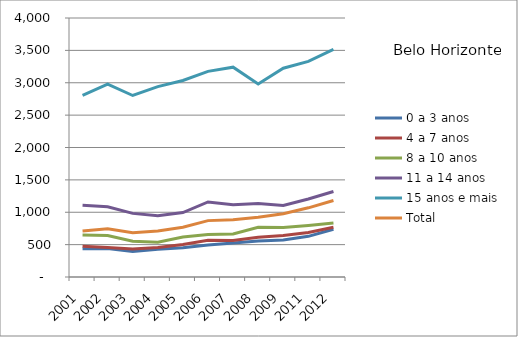
| Category | 0 a 3 anos | 4 a 7 anos | 8 a 10 anos | 11 a 14 anos | 15 anos e mais | Total |
|---|---|---|---|---|---|---|
| 2001.0 | 436.71 | 476.2 | 649.04 | 1107.44 | 2804.37 | 710.93 |
| 2002.0 | 441.62 | 457.3 | 640.36 | 1084.93 | 2978.75 | 745.3 |
| 2003.0 | 394.66 | 434.2 | 552.53 | 982.63 | 2803.11 | 684.17 |
| 2004.0 | 429.87 | 457.41 | 536.12 | 947.94 | 2940.8 | 712.04 |
| 2005.0 | 450.38 | 500.71 | 617.97 | 994.53 | 3035.41 | 768.5 |
| 2006.0 | 495.44 | 566.81 | 655.37 | 1158.65 | 3175.63 | 870.7 |
| 2007.0 | 525.1 | 565.44 | 665.12 | 1114.33 | 3240.51 | 883.22 |
| 2008.0 | 554.21 | 615.47 | 767.21 | 1133.79 | 2980.6 | 923.24 |
| 2009.0 | 570.33 | 642.17 | 762.77 | 1103.5 | 3224.31 | 978.26 |
| 2011.0 | 627.82 | 688.37 | 796.93 | 1205.36 | 3329.4 | 1068.36 |
| 2012.0 | 737.4 | 767.42 | 834.59 | 1320 | 3513.87 | 1180.98 |